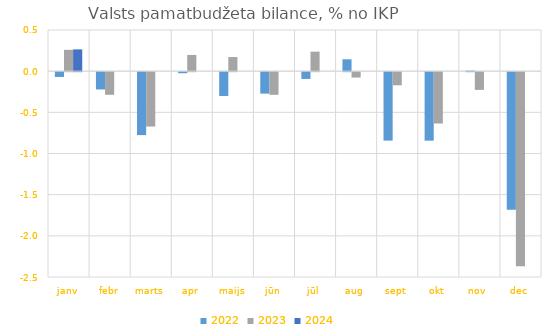
| Category | 2022 | 2023 | 2024 |
|---|---|---|---|
| janv | -0.058 | 0.259 | 0.265 |
| febr | -0.21 | -0.274 | 0 |
| marts | -0.764 | -0.66 | 0 |
| apr | -0.013 | 0.197 | 0 |
| maijs | -0.289 | 0.172 | 0 |
| jūn | -0.261 | -0.275 | 0 |
| jūl | -0.082 | 0.237 | 0 |
| aug | 0.144 | -0.065 | 0 |
| sept | -0.831 | -0.159 | 0 |
| okt | -0.832 | -0.623 | 0 |
| nov | 0.006 | -0.215 | 0 |
| dec | -1.67 | -2.358 | 0 |